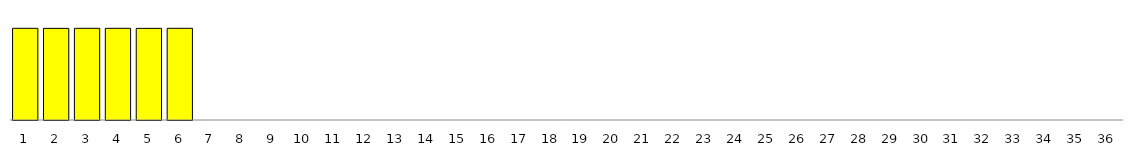
| Category | Series 0 |
|---|---|
| 1.0 | 0.167 |
| 2.0 | 0.167 |
| 3.0 | 0.167 |
| 4.0 | 0.167 |
| 5.0 | 0.167 |
| 6.0 | 0.167 |
| 7.0 | 0 |
| 8.0 | 0 |
| 9.0 | 0 |
| 10.0 | 0 |
| 11.0 | 0 |
| 12.0 | 0 |
| 13.0 | 0 |
| 14.0 | 0 |
| 15.0 | 0 |
| 16.0 | 0 |
| 17.0 | 0 |
| 18.0 | 0 |
| 19.0 | 0 |
| 20.0 | 0 |
| 21.0 | 0 |
| 22.0 | 0 |
| 23.0 | 0 |
| 24.0 | 0 |
| 25.0 | 0 |
| 26.0 | 0 |
| 27.0 | 0 |
| 28.0 | 0 |
| 29.0 | 0 |
| 30.0 | 0 |
| 31.0 | 0 |
| 32.0 | 0 |
| 33.0 | 0 |
| 34.0 | 0 |
| 35.0 | 0 |
| 36.0 | 0 |